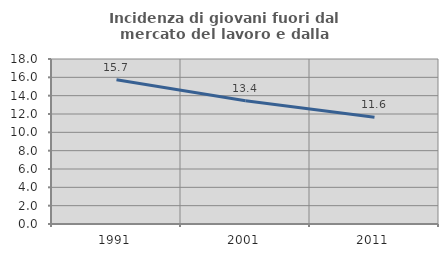
| Category | Incidenza di giovani fuori dal mercato del lavoro e dalla formazione  |
|---|---|
| 1991.0 | 15.733 |
| 2001.0 | 13.45 |
| 2011.0 | 11.639 |